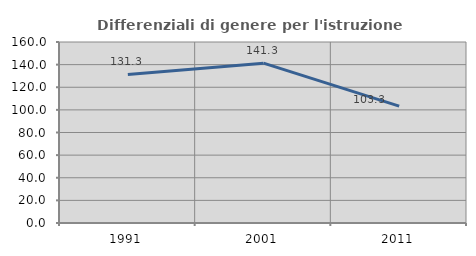
| Category | Differenziali di genere per l'istruzione superiore |
|---|---|
| 1991.0 | 131.313 |
| 2001.0 | 141.304 |
| 2011.0 | 103.31 |